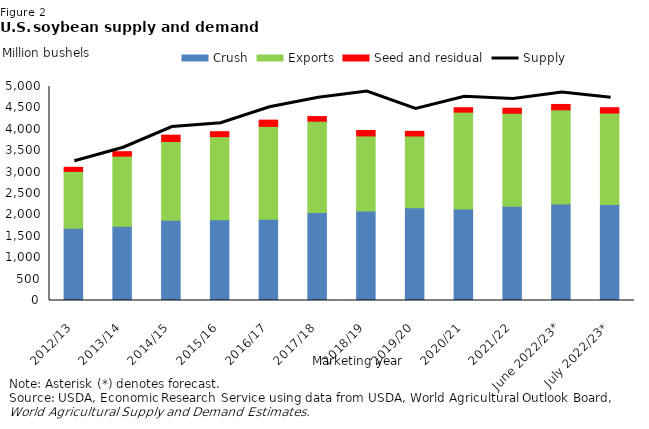
| Category | Crush | Exports | Seed and residual |
|---|---|---|---|
| 2012/13 | 1689 | 1327.526 | 94.847 |
| 2013/14 | 1734 | 1638.559 | 104.788 |
| 2014/15 | 1873 | 1842.175 | 147.5 |
| 2015/16 | 1886.237 | 1942.606 | 115.358 |
| 2016/17 | 1901.198 | 2166.551 | 146.162 |
| 2017/18 | 2054.932 | 2133.731 | 108.271 |
| 2018/19 | 2091.99 | 1753.43 | 125.84 |
| 2019/20 | 2164.554 | 1679.237 | 108.008 |
| 2020/21 | 2140.585 | 2260.553 | 102.564 |
| 2021/22 | 2205 | 2170 | 117.28 |
| June 2022/23* | 2255 | 2200 | 125.372 |
| July 2022/23* | 2245 | 2135 | 124.697 |